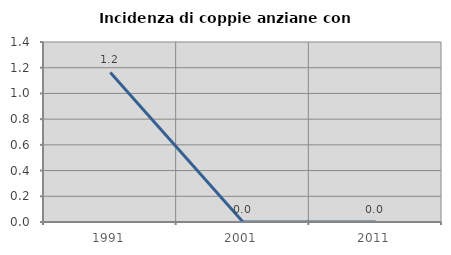
| Category | Incidenza di coppie anziane con figli |
|---|---|
| 1991.0 | 1.163 |
| 2001.0 | 0 |
| 2011.0 | 0 |